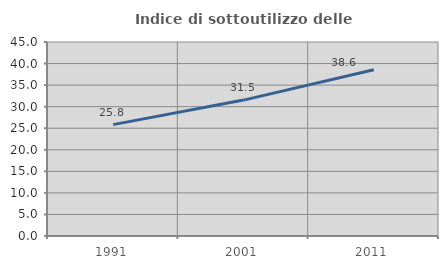
| Category | Indice di sottoutilizzo delle abitazioni  |
|---|---|
| 1991.0 | 25.84 |
| 2001.0 | 31.524 |
| 2011.0 | 38.582 |